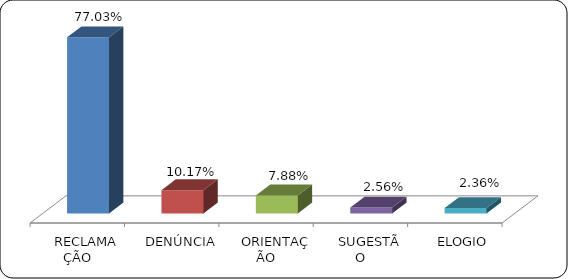
| Category | Series 0 |
|---|---|
|      RECLAMAÇÃO | 0.77 |
|      DENÚNCIA | 0.102 |
|      ORIENTAÇÃO | 0.079 |
|      SUGESTÃO | 0.026 |
|      ELOGIO | 0.024 |